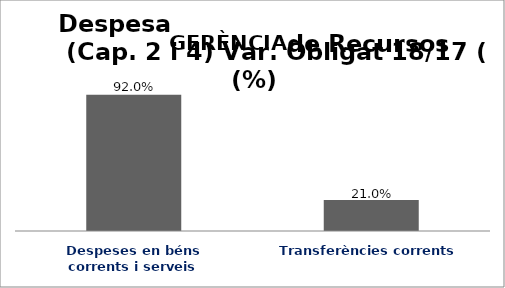
| Category | Series 0 |
|---|---|
| Despeses en béns corrents i serveis | 0.92 |
| Transferències corrents | 0.21 |